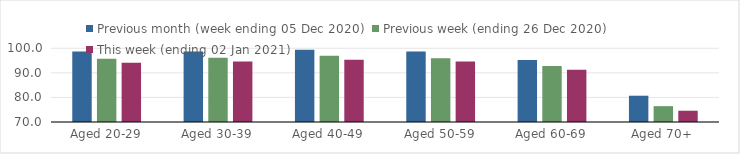
| Category | Previous month (week ending 05 Dec 2020) | Previous week (ending 26 Dec 2020) | This week (ending 02 Jan 2021) |
|---|---|---|---|
| Aged 20-29 | 98.69 | 95.79 | 94.07 |
| Aged 30-39 | 98.71 | 96.1 | 94.65 |
| Aged 40-49 | 99.38 | 97 | 95.36 |
| Aged 50-59 | 98.74 | 95.98 | 94.59 |
| Aged 60-69 | 95.23 | 92.74 | 91.23 |
| Aged 70+ | 80.7 | 76.45 | 74.59 |